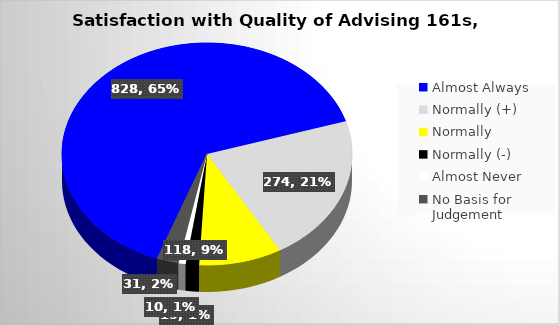
| Category | Series 0 |
|---|---|
| Almost Always | 828 |
| Normally (+) | 274 |
| Normally  | 118 |
| Normally (-) | 19 |
| Almost Never | 10 |
| No Basis for Judgement  | 31 |